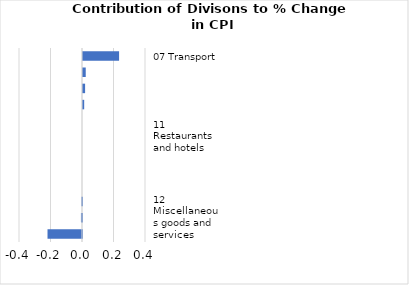
| Category |     Contributions |
|---|---|
| 07 Transport | 0.229 |
| 02 Alcoholic beverages, tobacco and narcotics | 0.017 |
| 04 Housing, water, electricity, gas and other fuels | 0.013 |
| 05 Furnishings, household equipment and maintenance | 0.008 |
| 06 Health | 0 |
| 11 Restaurants and hotels | 0 |
| 08 Communication | 0 |
| 10 Education | 0 |
| 09 Recreation and culture | 0 |
| 03 Clothing and footwear | -0.004 |
| 12 Miscellaneous goods and services | -0.007 |
| 01 Food and non-alcoholic beverages | -0.219 |